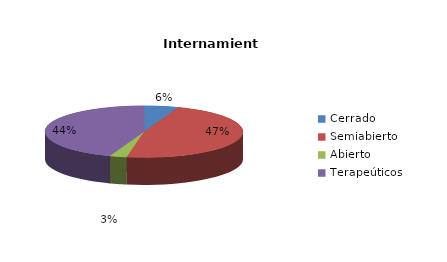
| Category | Series 0 |
|---|---|
| Cerrado | 2 |
| Semiabierto | 17 |
| Abierto | 1 |
| Terapeúticos | 16 |